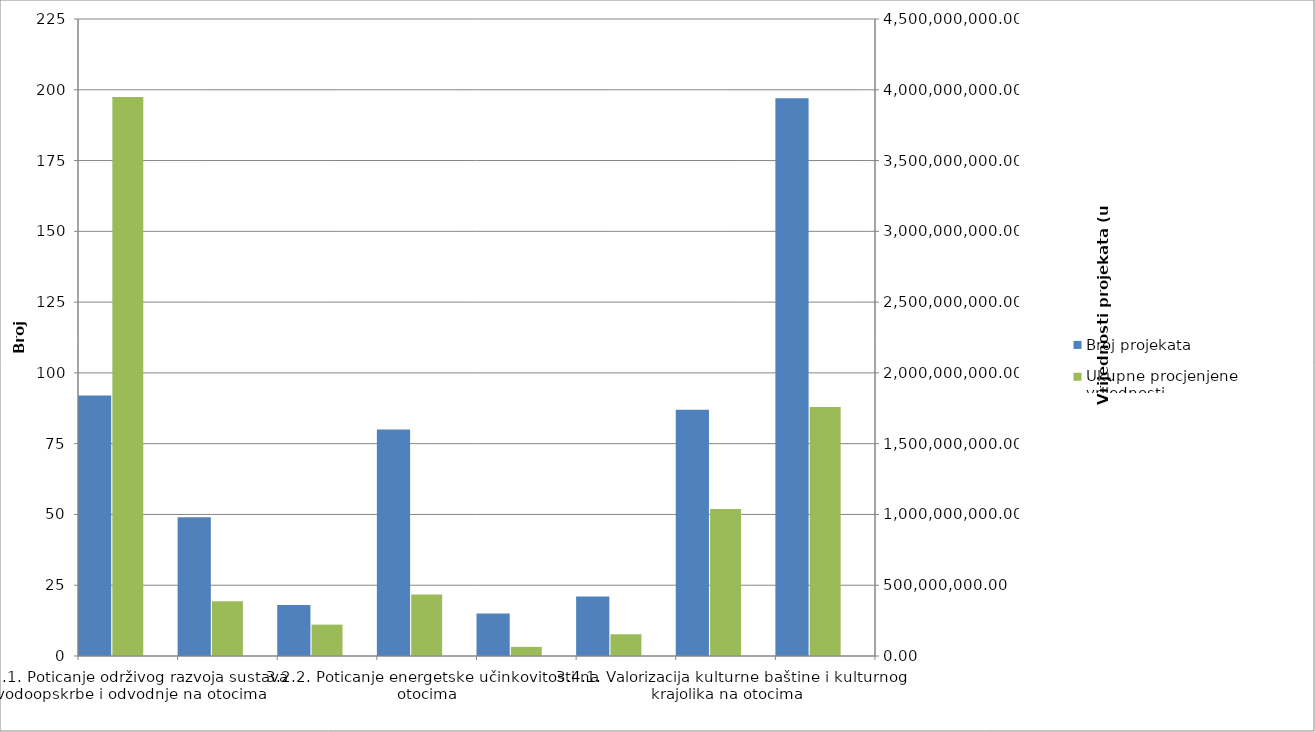
| Category | Broj projekata | Series 1 |
|---|---|---|
| 3.1.1. Poticanje održivog razvoja sustava vodoopskrbe i odvodnje na otocima | 92 |  |
| 3.1.2. Unaprjeđenje sustava gospodarenja otpadom na otocima i prelazak na kružno gospodarstvo | 49 |  |
| 3.2.1. Unaprjeđenje opskrbe energijom i poticanje korištenja obnovljivih izvora energije na otocima | 18 |  |
| 3.2.2. Poticanje energetske učinkovitosti na otocima | 80 |  |
| 3.3.1. Unaprjeđenje zaštite i upravljanja prirodnim resursima i okolišem na otocima | 15 |  |
| 3.3.2. Jačanje spremnosti i otpornosti otoka na prirodne nepogode i utjecaj klimatskih promjena | 21 |  |
| 3.4.1. Valorizacija kulturne baštine i kulturnog krajolika na otocima | 87 |  |
| 3.4.2. Unaprjeđenje infrastrukture za sportsku, rekreativnu i ostalu javnu namjenu na otocima | 197 |  |